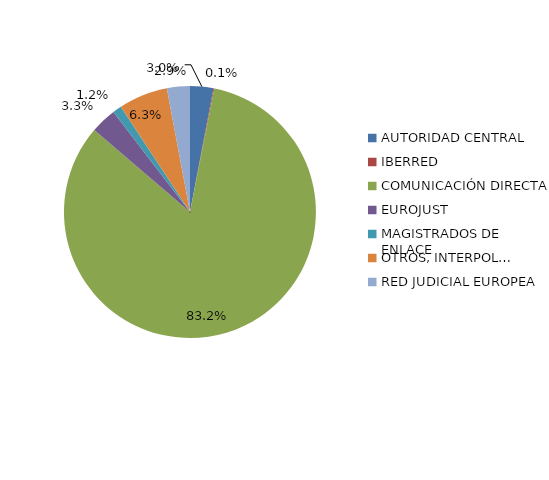
| Category | Series 0 |
|---|---|
| AUTORIDAD CENTRAL | 192 |
| IBERRED | 7 |
| COMUNICACIÓN DIRECTA | 5341 |
| EUROJUST | 214 |
| MAGISTRADOS DE ENLACE | 74 |
| OTROS, INTERPOL… | 405 |
| RED JUDICIAL EUROPEA | 189 |